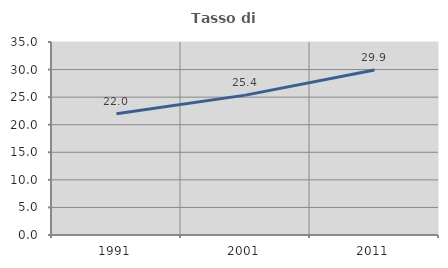
| Category | Tasso di occupazione   |
|---|---|
| 1991.0 | 22.007 |
| 2001.0 | 25.365 |
| 2011.0 | 29.908 |